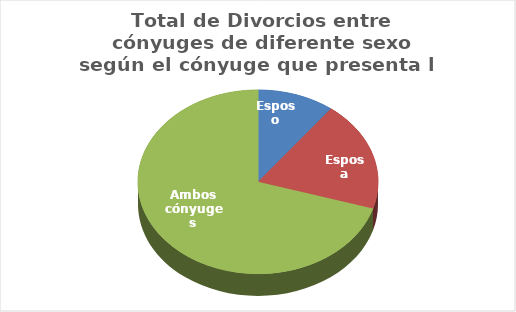
| Category | Series 0 |
|---|---|
| Esposo | 8253 |
| Esposa | 15364 |
| Ambos cónyuges | 55936 |